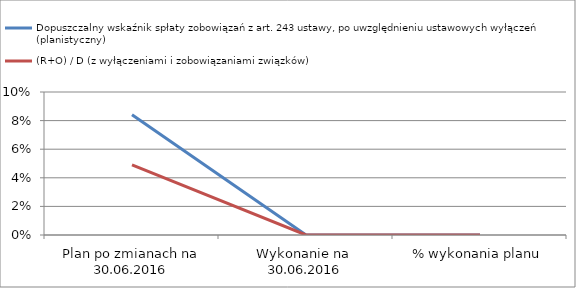
| Category | Dopuszczalny wskaźnik spłaty zobowiązań z art. 243 ustawy, po uwzględnieniu ustawowych wyłączeń (planistyczny)  | (R+O) / D (z wyłączeniami i zobowiązaniami związków) |
|---|---|---|
| Plan po zmianach na 30.06.2016 | 0.084 | 0.049 |
| Wykonanie na  30.06.2016 | 0 | 0 |
| % wykonania planu | 0 | 0 |